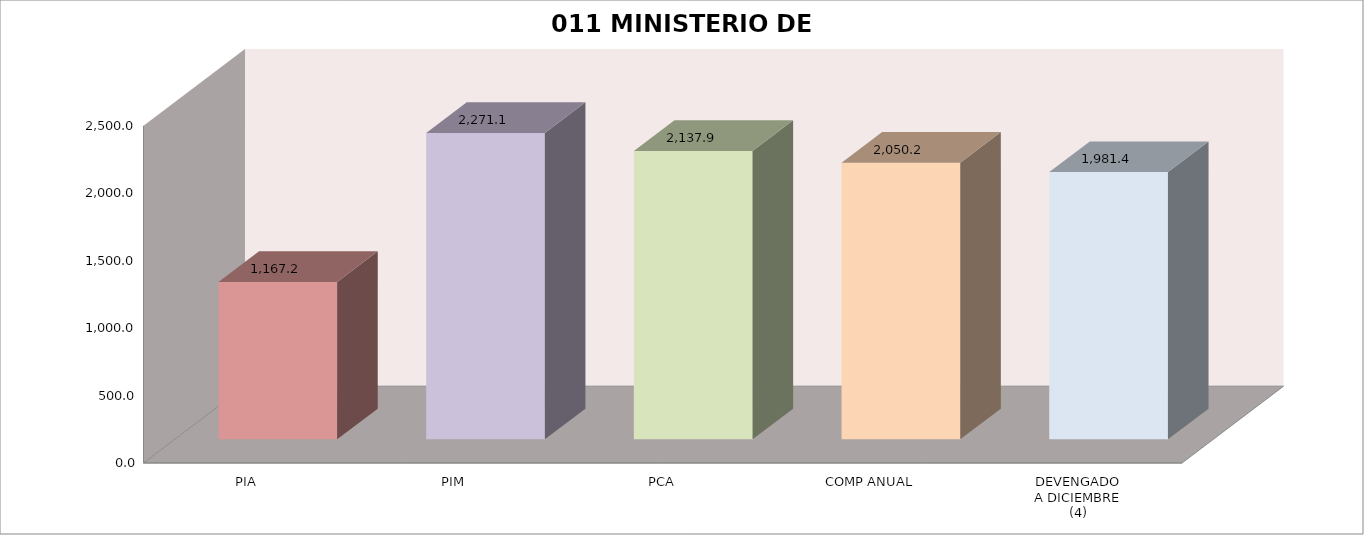
| Category | 011 MINISTERIO DE SALUD |
|---|---|
| PIA | 1167.209 |
| PIM | 2271.071 |
| PCA | 2137.922 |
| COMP ANUAL | 2050.246 |
| DEVENGADO
A DICIEMBRE
(4) | 1981.402 |